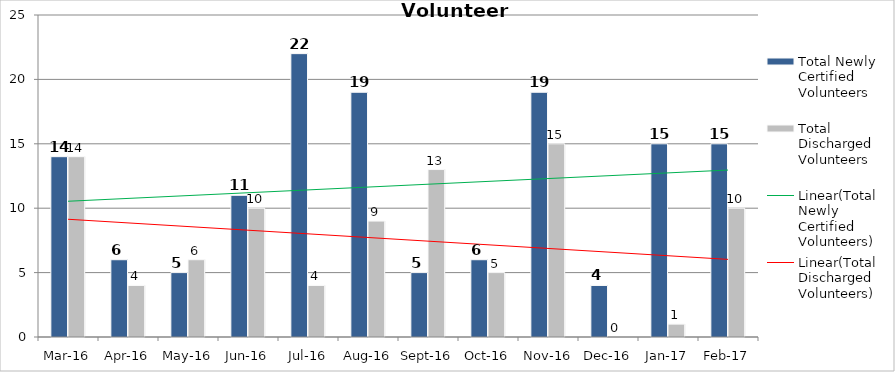
| Category | Total Newly Certified Volunteers | Total Discharged Volunteers |
|---|---|---|
| Mar-16 | 14 | 14 |
| Apr-16 | 6 | 4 |
| May-16 | 5 | 6 |
| Jun-16 | 11 | 10 |
| Jul-16 | 22 | 4 |
| Aug-16 | 19 | 9 |
| Sep-16 | 5 | 13 |
| Oct-16 | 6 | 5 |
| Nov-16 | 19 | 15 |
| Dec-16 | 4 | 0 |
| Jan-17 | 15 | 1 |
| Feb-17 | 15 | 10 |